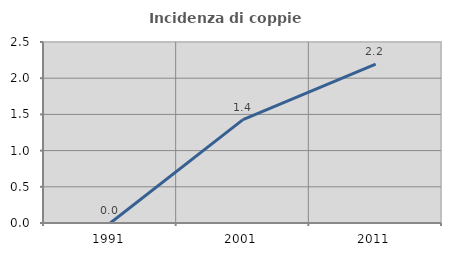
| Category | Incidenza di coppie miste |
|---|---|
| 1991.0 | 0 |
| 2001.0 | 1.429 |
| 2011.0 | 2.196 |